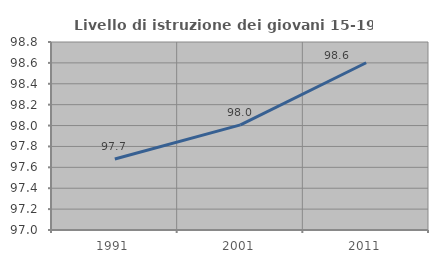
| Category | Livello di istruzione dei giovani 15-19 anni |
|---|---|
| 1991.0 | 97.68 |
| 2001.0 | 98.006 |
| 2011.0 | 98.601 |